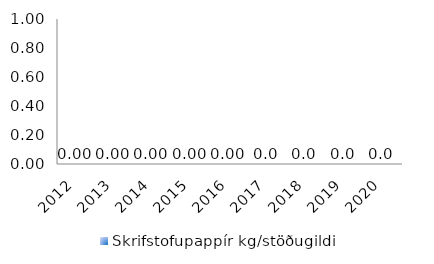
| Category | Skrifstofupappír kg/stöðugildi |
|---|---|
| 2012.0 | 0 |
| 2013.0 | 0 |
| 2014.0 | 0 |
| 2015.0 | 0 |
| 2016.0 | 0 |
| 2017.0 | 0 |
| 2018.0 | 0 |
| 2019.0 | 0 |
| 2020.0 | 0 |